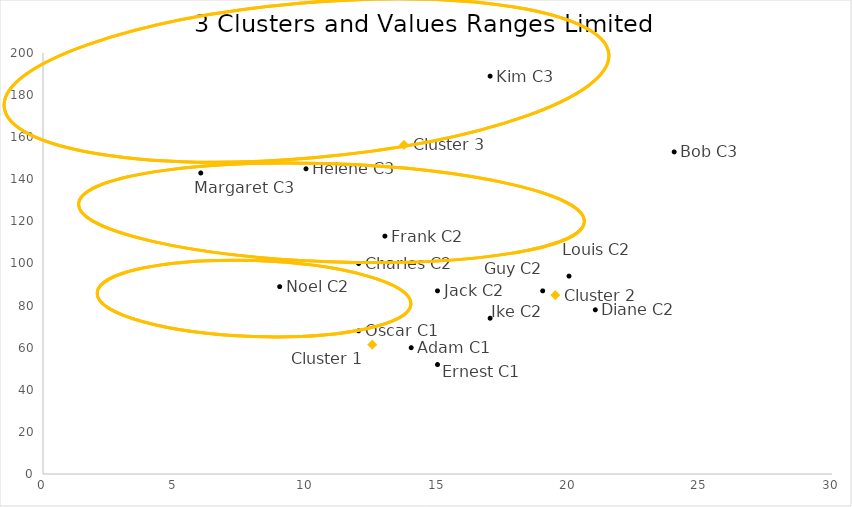
| Category | Series 0 |
|---|---|
| 12.51946607044869 | 61.481 |
| 19.475478059841894 | 85.005 |
| 13.724617803094118 | 156.377 |
| 14.0 | 60 |
| 24.0 | 153 |
| 12.0 | 100 |
| 21.0 | 78 |
| 15.0 | 52 |
| 13.0 | 113 |
| 19.0 | 87 |
| 10.0 | 145 |
| 17.0 | 74 |
| 15.0 | 87 |
| 17.0 | 189 |
| 20.0 | 94 |
| 6.0 | 143 |
| 9.0 | 89 |
| 12.0 | 68 |